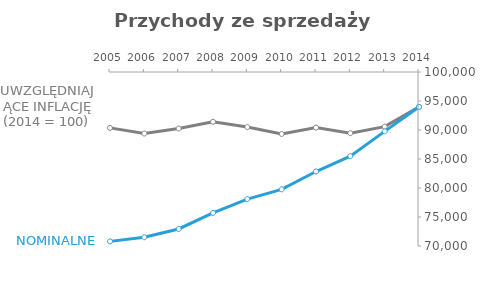
| Category | Series 0 | Series 1 |
|---|---|---|
| 2005.0 | 90364.01 | 70797 |
| 2006.0 | 89390.489 | 71505 |
| 2007.0 | 90275.419 | 72935 |
| 2008.0 | 91420.943 | 75707 |
| 2009.0 | 90499.981 | 78092 |
| 2010.0 | 89319.571 | 79771 |
| 2011.0 | 90407.572 | 82842 |
| 2012.0 | 89454.147 | 85493 |
| 2013.0 | 90575.912 | 89768 |
| 2014.0 | 93987 | 93987 |